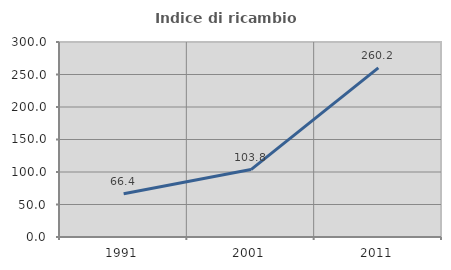
| Category | Indice di ricambio occupazionale  |
|---|---|
| 1991.0 | 66.441 |
| 2001.0 | 103.756 |
| 2011.0 | 260.207 |